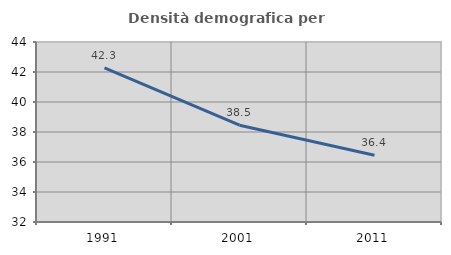
| Category | Densità demografica |
|---|---|
| 1991.0 | 42.269 |
| 2001.0 | 38.453 |
| 2011.0 | 36.448 |